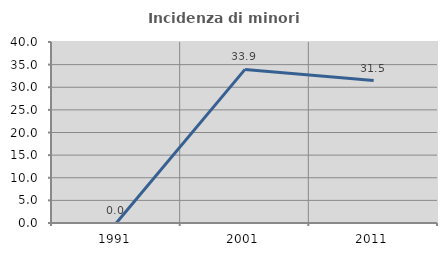
| Category | Incidenza di minori stranieri |
|---|---|
| 1991.0 | 0 |
| 2001.0 | 33.945 |
| 2011.0 | 31.481 |